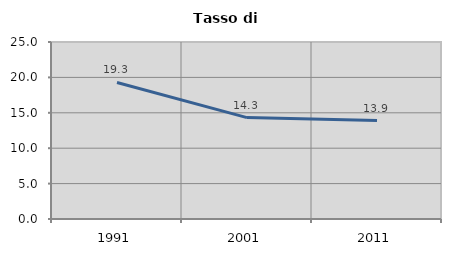
| Category | Tasso di disoccupazione   |
|---|---|
| 1991.0 | 19.282 |
| 2001.0 | 14.32 |
| 2011.0 | 13.897 |